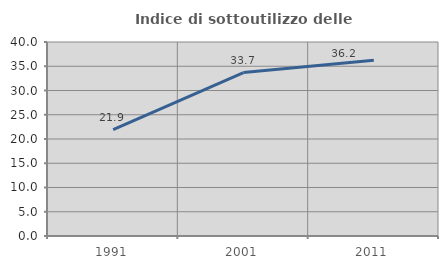
| Category | Indice di sottoutilizzo delle abitazioni  |
|---|---|
| 1991.0 | 21.922 |
| 2001.0 | 33.696 |
| 2011.0 | 36.226 |